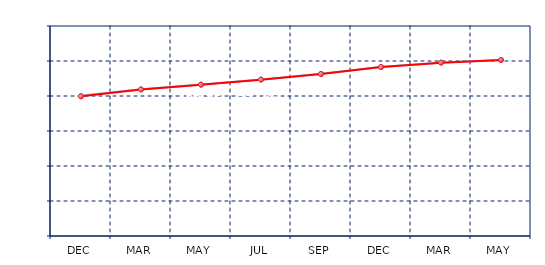
| Category | Series 0 | Series 1 |
|---|---|---|
| DEC | 400.5 | 399 |
| MAR | 419.5 | 418.75 |
| MAY | 432.75 | 432.25 |
| JUL | 447.25 | 446.75 |
| SEP | 463.25 | 462.75 |
| DEC | 483 | 482.75 |
| MAR | 495.25 | 495.25 |
| MAY | 503.125 | 503 |